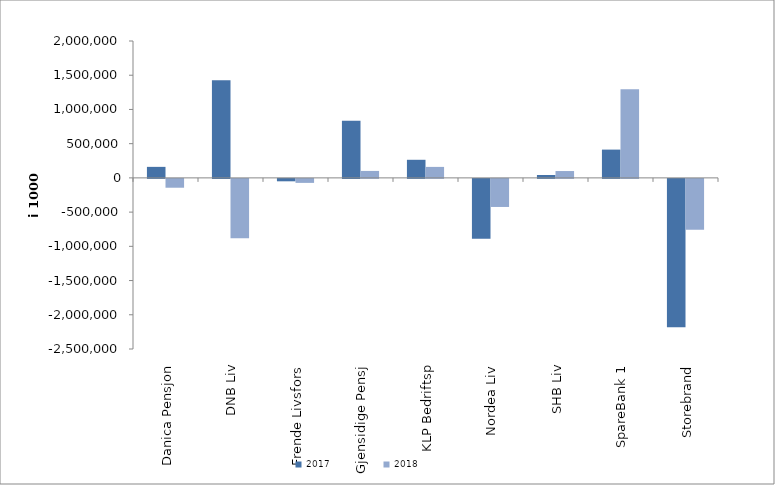
| Category | 2017 | 2018 |
|---|---|---|
| Danica Pensjon | 161022.167 | -129055.097 |
| DNB Liv | 1424944 | -867214 |
| Frende Livsfors | -35332.914 | -58437.729 |
| Gjensidige Pensj | 835231 | 101669 |
| KLP Bedriftsp | 264421 | 160568 |
| Nordea Liv | -874319.181 | -410143.851 |
| SHB Liv | 42014 | 100114 |
| SpareBank 1 | 413293.575 | 1294387.703 |
| Storebrand | -2167031.818 | -744724.326 |